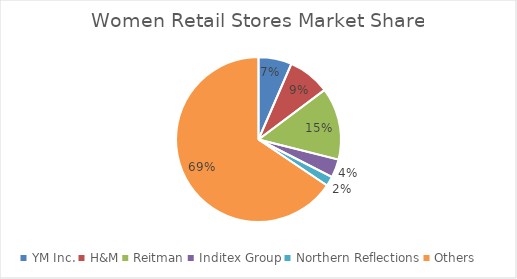
| Category | Series 0 |
|---|---|
| YM Inc. | 0.069 |
| H&M | 0.087 |
| Reitman | 0.15 |
| Inditex Group | 0.038 |
| Northern Reflections | 0.02 |
| Others | 0.694 |